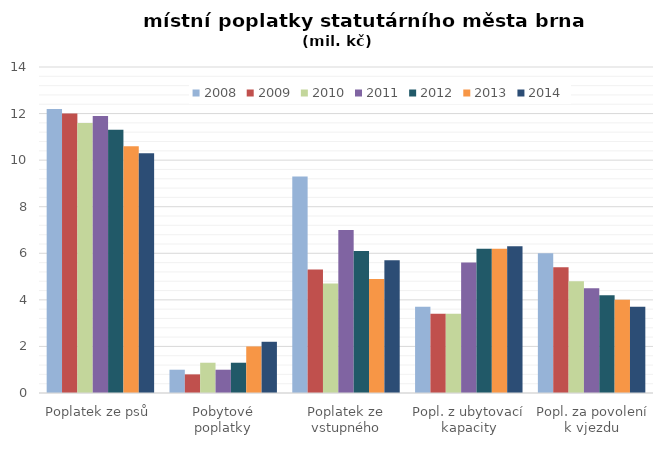
| Category | 2008 | 2009 | 2010 | 2011 | 2012 | 2013 | 2014 |
|---|---|---|---|---|---|---|---|
| Poplatek ze psů | 12.2 | 12 | 11.6 | 11.9 | 11.3 | 10.6 | 10.3 |
| Pobytové poplatky | 1 | 0.8 | 1.3 | 1 | 1.3 | 2 | 2.2 |
| Poplatek ze vstupného | 9.3 | 5.3 | 4.7 | 7 | 6.1 | 4.9 | 5.7 |
| Popl. z ubytovací kapacity | 3.7 | 3.4 | 3.4 | 5.6 | 6.2 | 6.2 | 6.3 |
| Popl. za povolení k vjezdu | 6 | 5.4 | 4.8 | 4.5 | 4.2 | 4 | 3.7 |